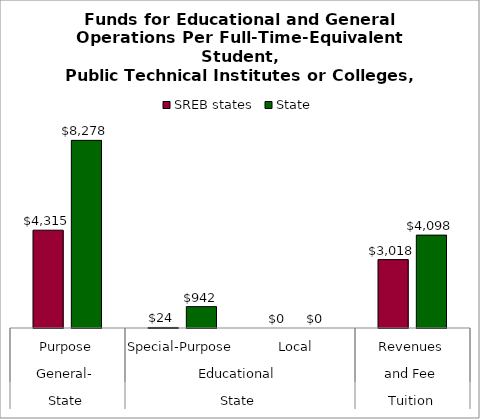
| Category | SREB states | State |
|---|---|---|
| 0 | 4315.173 | 8278.086 |
| 1 | 24.123 | 942.236 |
| 2 | 0 | 0 |
| 3 | 3017.753 | 4097.861 |